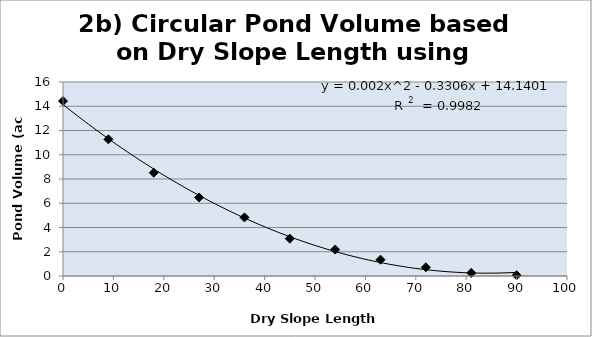
| Category | Series 0 |
|---|---|
| 90.0 | 0.064 |
| 81.0 | 0.258 |
| 72.0 | 0.72 |
| 63.0 | 1.343 |
| 54.0 | 2.181 |
| 45.0 | 3.078 |
| 36.0 | 4.83 |
| 27.0 | 6.479 |
| 18.0 | 8.519 |
| 9.0 | 11.271 |
| 0.0 | 14.432 |
| nan | 0 |